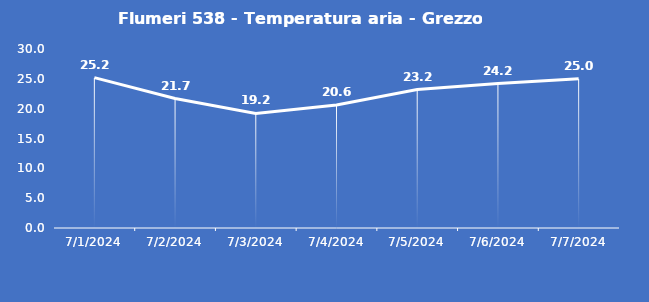
| Category | Flumeri 538 - Temperatura aria - Grezzo (°C) |
|---|---|
| 7/1/24 | 25.2 |
| 7/2/24 | 21.7 |
| 7/3/24 | 19.2 |
| 7/4/24 | 20.6 |
| 7/5/24 | 23.2 |
| 7/6/24 | 24.2 |
| 7/7/24 | 25 |